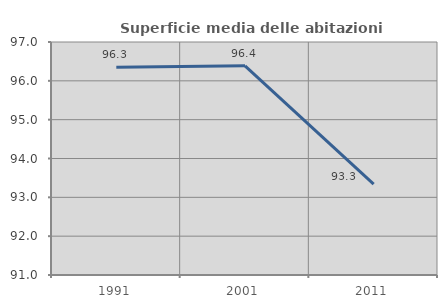
| Category | Superficie media delle abitazioni occupate |
|---|---|
| 1991.0 | 96.347 |
| 2001.0 | 96.387 |
| 2011.0 | 93.34 |